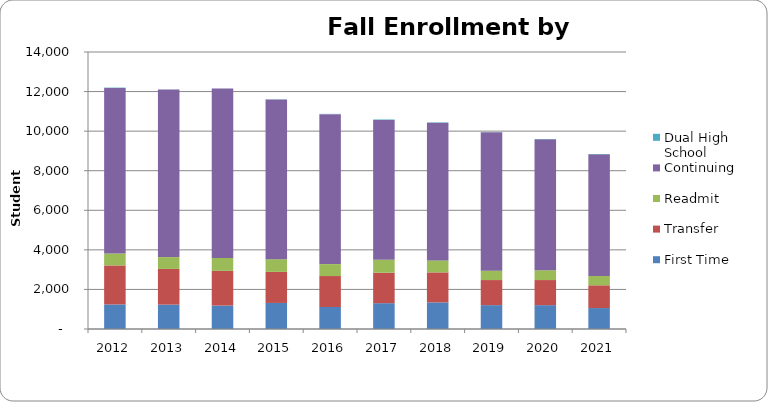
| Category | First Time | Transfer | Readmit | Continuing | Dual High School |
|---|---|---|---|---|---|
| 2012.0 | 1241 | 1972 | 604 | 8360 | 23 |
| 2013.0 | 1232 | 1804 | 599 | 8470 | 3 |
| 2014.0 | 1185 | 1752 | 657 | 8564 | 3 |
| 2015.0 | 1317 | 1570 | 641 | 8073 | 11 |
| 2016.0 | 1111 | 1566 | 604 | 7579 | 12 |
| 2017.0 | 1304 | 1540 | 656 | 7065 | 25 |
| 2018.0 | 1345 | 1516 | 607 | 6962 | 20 |
| 2019.0 | 1206 | 1268 | 476 | 6989 | 7 |
| 2020.0 | 1205 | 1269 | 497 | 6616 | 17 |
| 2021.0 | 1059 | 1150 | 470 | 6148 | 18 |